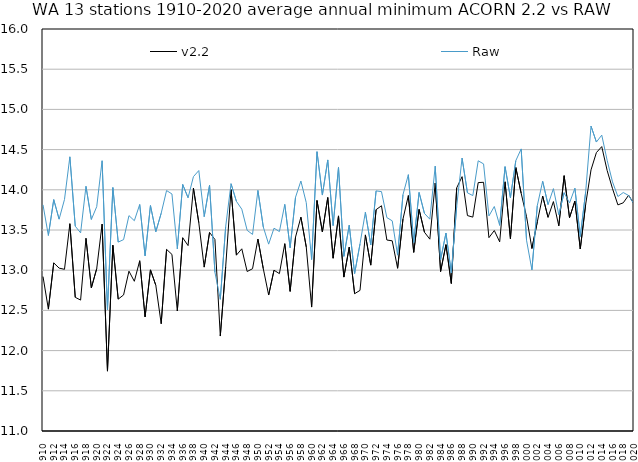
| Category | v2.2 | Raw |
|---|---|---|
| 1910 | 12.921 | 13.813 |
| 1911 | 12.516 | 13.432 |
| 1912 | 13.091 | 13.878 |
| 1913 | 13.026 | 13.635 |
| 1914 | 13.011 | 13.88 |
| 1915 | 13.579 | 14.41 |
| 1916 | 12.663 | 13.548 |
| 1917 | 12.628 | 13.464 |
| 1918 | 13.397 | 14.044 |
| 1919 | 12.78 | 13.631 |
| 1920 | 13.02 | 13.79 |
| 1921 | 13.574 | 14.361 |
| 1922 | 11.745 | 12.506 |
| 1923 | 13.311 | 14.028 |
| 1924 | 12.64 | 13.349 |
| 1925 | 12.692 | 13.38 |
| 1926 | 12.988 | 13.679 |
| 1927 | 12.862 | 13.616 |
| 1928 | 13.118 | 13.818 |
| 1929 | 12.419 | 13.179 |
| 1930 | 13.004 | 13.804 |
| 1931 | 12.812 | 13.478 |
| 1932 | 12.334 | 13.709 |
| 1933 | 13.259 | 13.991 |
| 1934 | 13.197 | 13.948 |
| 1935 | 12.493 | 13.265 |
| 1936 | 13.404 | 14.067 |
| 1937 | 13.306 | 13.901 |
| 1938 | 14.021 | 14.164 |
| 1939 | 13.591 | 14.239 |
| 1940 | 13.038 | 13.666 |
| 1941 | 13.469 | 14.057 |
| 1942 | 13.381 | 12.974 |
| 1943 | 12.181 | 12.638 |
| 1944 | 13.042 | 13.542 |
| 1945 | 14.002 | 14.076 |
| 1946 | 13.187 | 13.856 |
| 1947 | 13.266 | 13.759 |
| 1948 | 12.984 | 13.496 |
| 1949 | 13.018 | 13.445 |
| 1950 | 13.387 | 13.993 |
| 1951 | 13.019 | 13.538 |
| 1952 | 12.691 | 13.324 |
| 1953 | 13 | 13.523 |
| 1954 | 12.958 | 13.48 |
| 1955 | 13.33 | 13.819 |
| 1956 | 12.737 | 13.279 |
| 1957 | 13.412 | 13.907 |
| 1958 | 13.66 | 14.11 |
| 1959 | 13.29 | 13.84 |
| 1960 | 12.541 | 13.132 |
| 1961 | 13.867 | 14.474 |
| 1962 | 13.476 | 13.935 |
| 1963 | 13.904 | 14.372 |
| 1964 | 13.149 | 13.555 |
| 1965 | 13.675 | 14.279 |
| 1966 | 12.914 | 13.172 |
| 1967 | 13.287 | 13.56 |
| 1968 | 12.708 | 12.959 |
| 1969 | 12.749 | 13.326 |
| 1970 | 13.439 | 13.721 |
| 1971 | 13.063 | 13.314 |
| 1972 | 13.753 | 13.987 |
| 1973 | 13.802 | 13.977 |
| 1974 | 13.376 | 13.654 |
| 1975 | 13.365 | 13.614 |
| 1976 | 13.024 | 13.187 |
| 1977 | 13.636 | 13.94 |
| 1978 | 13.928 | 14.188 |
| 1979 | 13.222 | 13.345 |
| 1980 | 13.756 | 13.967 |
| 1981 | 13.472 | 13.706 |
| 1982 | 13.386 | 13.635 |
| 1983 | 14.084 | 14.294 |
| 1984 | 12.983 | 13.13 |
| 1985 | 13.318 | 13.462 |
| 1986 | 12.834 | 12.967 |
| 1987 | 14.024 | 13.794 |
| 1988 | 14.164 | 14.395 |
| 1989 | 13.68 | 13.963 |
| 1990 | 13.66 | 13.928 |
| 1991 | 14.089 | 14.361 |
| 1992 | 14.093 | 14.322 |
| 1993 | 13.405 | 13.675 |
| 1994 | 13.494 | 13.792 |
| 1995 | 13.352 | 13.557 |
| 1996 | 14.1 | 14.288 |
| 1997 | 13.391 | 13.902 |
| 1998 | 14.277 | 14.362 |
| 1999 | 13.956 | 14.509 |
| 2000 | 13.666 | 13.372 |
| 2001 | 13.27 | 13.004 |
| 2002 | 13.6 | 13.803 |
| 2003 | 13.922 | 14.106 |
| 2004 | 13.657 | 13.816 |
| 2005 | 13.853 | 14.015 |
| 2006 | 13.552 | 13.691 |
| 2007 | 14.176 | 13.964 |
| 2008 | 13.653 | 13.836 |
| 2009 | 13.86 | 14.019 |
| 2010 | 13.264 | 13.419 |
| 2011 | 13.818 | 13.972 |
| 2012 | 14.248 | 14.793 |
| 2013 | 14.463 | 14.594 |
| 2014 | 14.537 | 14.68 |
| 2015 | 14.241 | 14.367 |
| 2016 | 14.015 | 14.099 |
| 2017 | 13.812 | 13.916 |
| 2018 | 13.838 | 13.966 |
| 2019 | 13.933 | 13.929 |
| 2020 | 13.822 | 13.823 |